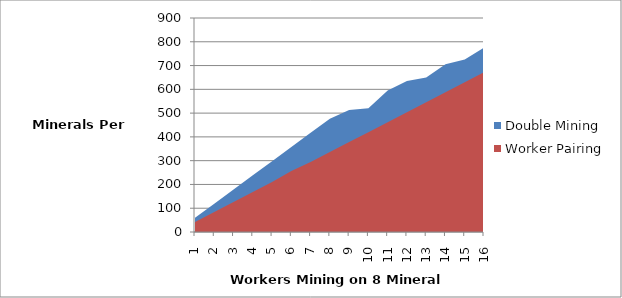
| Category | Double Mining | Worker Pairing |
|---|---|---|
| 1.0 | 59.6 | 42 |
| 2.0 | 119.2 | 84 |
| 3.0 | 178.8 | 126 |
| 4.0 | 238.4 | 168 |
| 5.0 | 298 | 210 |
| 6.0 | 357.6 | 257 |
| 7.0 | 417.2 | 294 |
| 8.0 | 476.8 | 336 |
| 9.0 | 513 | 378 |
| 10.0 | 520 | 420 |
| 11.0 | 595 | 462 |
| 12.0 | 635 | 504 |
| 13.0 | 650 | 546 |
| 14.0 | 705 | 588 |
| 15.0 | 725 | 630 |
| 16.0 | 775 | 672 |